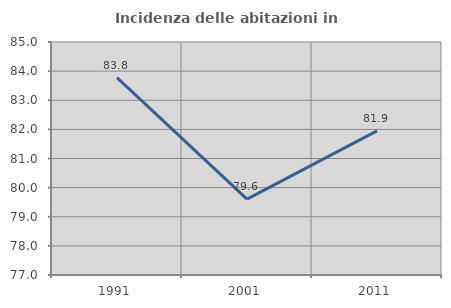
| Category | Incidenza delle abitazioni in proprietà  |
|---|---|
| 1991.0 | 83.776 |
| 2001.0 | 79.605 |
| 2011.0 | 81.946 |